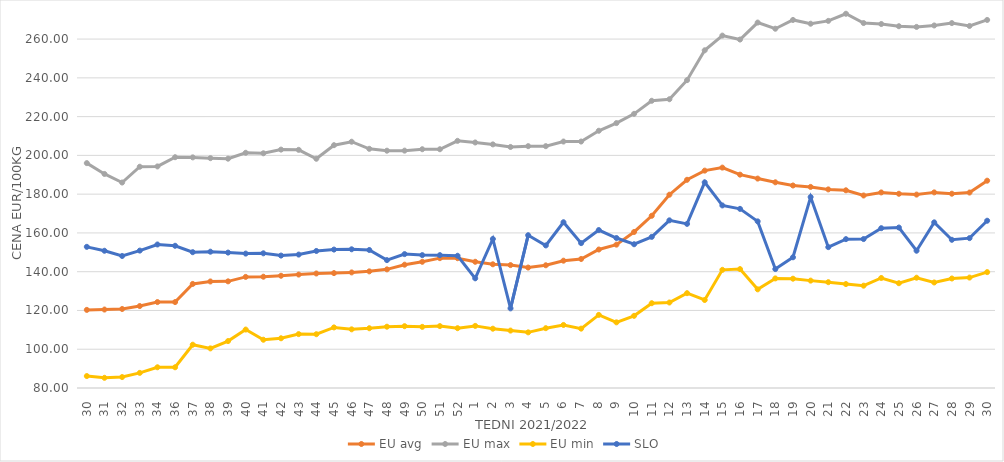
| Category | EU avg | EU max | EU min | SLO |
|---|---|---|---|---|
| 30.0 | 120.3 | 196.01 | 86.16 | 152.82 |
| 31.0 | 120.473 | 190.42 | 85.26 | 150.8 |
| 32.0 | 120.756 | 186 | 85.65 | 148.1 |
| 33.0 | 122.274 | 194.145 | 87.8 | 150.88 |
| 34.0 | 124.332 | 194.304 | 90.69 | 154.04 |
| 36.0 | 124.332 | 199.06 | 90.69 | 153.37 |
| 37.0 | 133.685 | 198.97 | 102.334 | 150.06 |
| 38.0 | 134.959 | 198.57 | 100.43 | 150.32 |
| 39.0 | 135.021 | 198.3 | 104.21 | 149.86 |
| 40.0 | 137.315 | 201.34 | 110.15 | 149.34 |
| 41.0 | 137.411 | 201.081 | 104.9 | 149.48 |
| 42.0 | 137.908 | 202.98 | 105.65 | 148.32 |
| 43.0 | 138.52 | 202.856 | 107.8 | 148.83 |
| 44.0 | 139.076 | 198.26 | 107.75 | 150.69 |
| 45.0 | 139.275 | 205.257 | 111.25 | 151.41 |
| 46.0 | 139.626 | 207.046 | 110.26 | 151.56 |
| 47.0 | 140.17 | 203.387 | 110.83 | 151.2 |
| 48.0 | 141.2 | 202.42 | 111.62 | 145.97 |
| 49.0 | 143.614 | 202.45 | 111.89 | 149.07 |
| 50.0 | 145.101 | 203.17 | 111.54 | 148.55 |
| 51.0 | 146.984 | 203.17 | 111.93 | 148.54 |
| 52.0 | 146.958 | 207.5 | 110.85 | 148.22 |
| 1.0 | 145.11 | 206.66 | 112.04 | 136.59 |
| 2.0 | 143.822 | 205.67 | 110.59 | 156.88 |
| 3.0 | 143.402 | 204.34 | 109.62 | 121.07 |
| 4.0 | 142.134 | 204.76 | 108.71 | 158.82 |
| 5.0 | 143.314 | 204.76 | 110.86 | 153.55 |
| 6.0 | 145.677 | 207.14 | 112.52 | 165.51 |
| 7.0 | 146.556 | 207.14 | 110.619 | 154.74 |
| 8.0 | 151.439 | 212.7 | 117.709 | 161.48 |
| 9.0 | 153.947 | 216.67 | 113.871 | 157.38 |
| 10.0 | 160.496 | 221.43 | 117.233 | 154.16 |
| 11.0 | 168.845 | 228.17 | 123.737 | 157.96 |
| 12.0 | 179.714 | 228.97 | 124.105 | 166.49 |
| 13.0 | 187.409 | 238.81 | 128.918 | 164.66 |
| 14.0 | 192.137 | 254.21 | 125.399 | 186.11 |
| 15.0 | 193.697 | 261.79 | 140.954 | 174.18 |
| 16.0 | 190.066 | 259.76 | 141.337 | 172.42 |
| 17.0 | 188.031 | 268.52 | 130.897 | 165.96 |
| 18.0 | 186.119 | 265.34 | 136.529 | 141.36 |
| 19.0 | 184.47 | 269.87 | 136.387 | 147.43 |
| 20.0 | 183.734 | 267.92 | 135.392 | 178.51 |
| 21.0 | 182.45 | 269.38 | 134.589 | 152.67 |
| 22.0 | 181.991 | 273.06 | 133.621 | 156.8 |
| 23.0 | 179.308 | 268.27 | 132.787 | 156.84 |
| 24.0 | 180.886 | 267.77 | 136.75 | 162.44 |
| 25.0 | 180.2 | 266.63 | 134.058 | 162.78 |
| 26.0 | 179.77 | 266.27 | 136.895 | 150.82 |
| 27.0 | 180.913 | 267.02 | 134.44 | 165.45 |
| 28.0 | 180.226 | 268.25 | 136.486 | 156.46 |
| 29.0 | 180.834 | 266.77 | 136.97 | 157.31 |
| 30.0 | 186.945 | 269.87 | 139.777 | 166.29 |